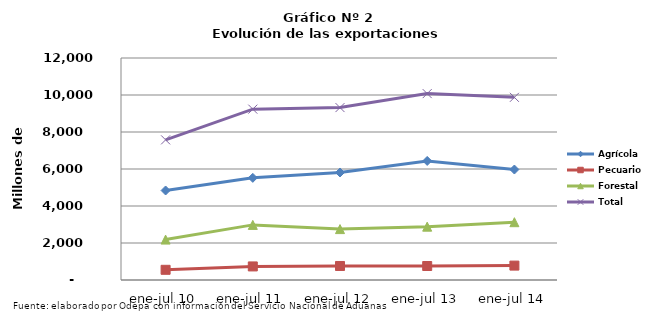
| Category | Agrícola | Pecuario | Forestal | Total |
|---|---|---|---|---|
| ene-jul 10 | 4838522 | 551466 | 2184753 | 7574741 |
| ene-jul 11 | 5521778 | 733859 | 2979375 | 9235012 |
| ene-jul 12 | 5810969 | 757830 | 2751629 | 9320428 |
| ene-jul 13 | 6435296 | 756167 | 2882967 | 10074430 |
| ene-jul 14 | 5971341 | 777874 | 3124242 | 9873457 |